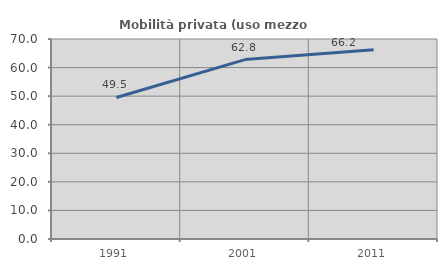
| Category | Mobilità privata (uso mezzo privato) |
|---|---|
| 1991.0 | 49.531 |
| 2001.0 | 62.787 |
| 2011.0 | 66.205 |